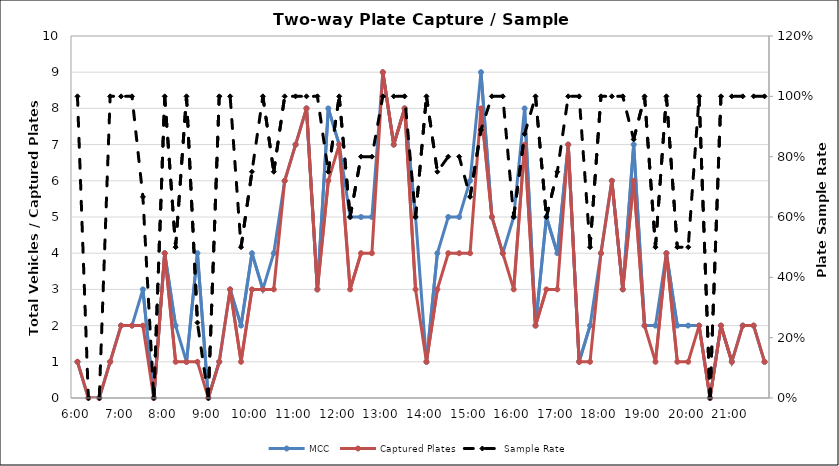
| Category | MCC | Captured Plates |
|---|---|---|
| 0.25 | 1 | 1 |
| 0.260416666666667 | 0 | 0 |
| 0.270833333333333 | 0 | 0 |
| 0.28125 | 1 | 1 |
| 0.291666666666667 | 2 | 2 |
| 0.302083333333333 | 2 | 2 |
| 0.3125 | 3 | 2 |
| 0.322916666666667 | 0 | 0 |
| 0.333333333333333 | 4 | 4 |
| 0.34375 | 2 | 1 |
| 0.354166666666667 | 1 | 1 |
| 0.364583333333333 | 4 | 1 |
| 0.375 | 0 | 0 |
| 0.385416666666667 | 1 | 1 |
| 0.395833333333333 | 3 | 3 |
| 0.40625 | 2 | 1 |
| 0.416666666666667 | 4 | 3 |
| 0.427083333333333 | 3 | 3 |
| 0.4375 | 4 | 3 |
| 0.447916666666667 | 6 | 6 |
| 0.458333333333333 | 7 | 7 |
| 0.46875 | 8 | 8 |
| 0.479166666666667 | 3 | 3 |
| 0.489583333333333 | 8 | 6 |
| 0.5 | 7 | 7 |
| 0.510416666666667 | 5 | 3 |
| 0.520833333333333 | 5 | 4 |
| 0.53125 | 5 | 4 |
| 0.541666666666667 | 9 | 9 |
| 0.552083333333333 | 7 | 7 |
| 0.5625 | 8 | 8 |
| 0.572916666666667 | 5 | 3 |
| 0.583333333333333 | 1 | 1 |
| 0.59375 | 4 | 3 |
| 0.604166666666667 | 5 | 4 |
| 0.614583333333333 | 5 | 4 |
| 0.625 | 6 | 4 |
| 0.635416666666667 | 9 | 8 |
| 0.645833333333333 | 5 | 5 |
| 0.65625 | 4 | 4 |
| 0.666666666666667 | 5 | 3 |
| 0.677083333333333 | 8 | 7 |
| 0.6875 | 2 | 2 |
| 0.697916666666667 | 5 | 3 |
| 0.708333333333333 | 4 | 3 |
| 0.71875 | 7 | 7 |
| 0.729166666666667 | 1 | 1 |
| 0.739583333333333 | 2 | 1 |
| 0.75 | 4 | 4 |
| 0.760416666666667 | 6 | 6 |
| 0.770833333333333 | 3 | 3 |
| 0.78125 | 7 | 6 |
| 0.791666666666667 | 2 | 2 |
| 0.802083333333333 | 2 | 1 |
| 0.8125 | 4 | 4 |
| 0.822916666666667 | 2 | 1 |
| 0.833333333333333 | 2 | 1 |
| 0.84375 | 2 | 2 |
| 0.854166666666667 | 0 | 0 |
| 0.864583333333333 | 2 | 2 |
| 0.875 | 1 | 1 |
| 0.885416666666667 | 2 | 2 |
| 0.895833333333333 | 2 | 2 |
| 0.90625 | 1 | 1 |